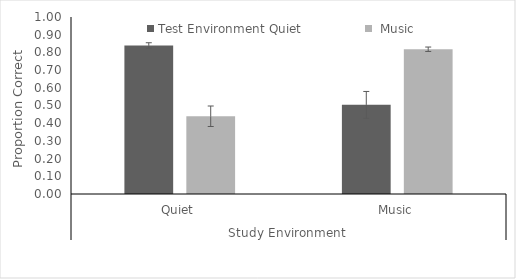
| Category | Test Environment |
|---|---|
| 0 | 0.439 |
| 1 | 0.818 |